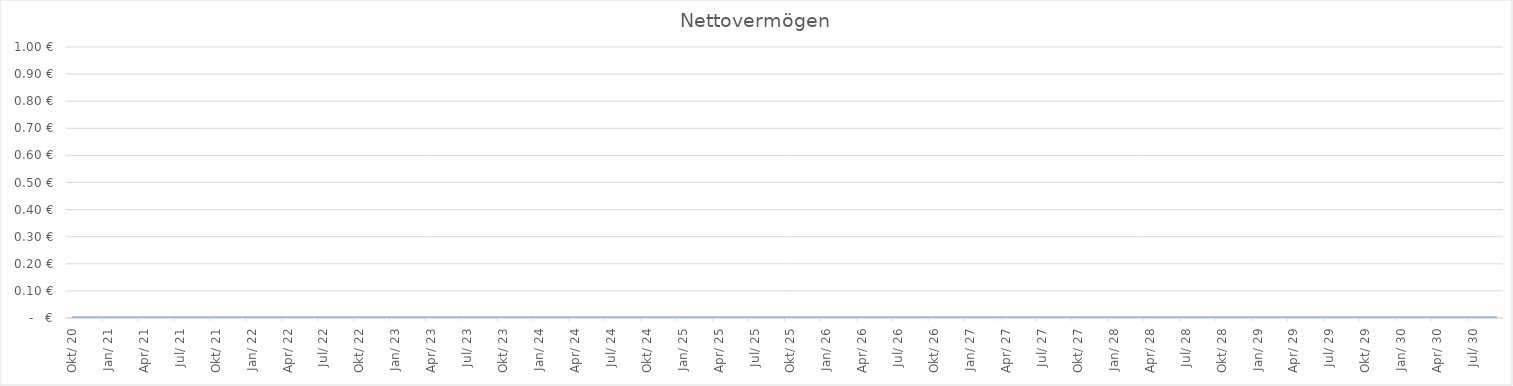
| Category | Nettovermögen |
|---|---|
| 2020-10-01 | 0 |
| 2020-11-01 | 0 |
| 2020-12-01 | 0 |
| 2021-01-01 | 0 |
| 2021-02-01 | 0 |
| 2021-03-01 | 0 |
| 2021-04-01 | 0 |
| 2021-05-01 | 0 |
| 2021-06-01 | 0 |
| 2021-07-01 | 0 |
| 2021-08-01 | 0 |
| 2021-09-01 | 0 |
| 2021-10-01 | 0 |
| 2021-11-01 | 0 |
| 2021-12-01 | 0 |
| 2022-01-01 | 0 |
| 2022-02-01 | 0 |
| 2022-03-01 | 0 |
| 2022-04-01 | 0 |
| 2022-05-01 | 0 |
| 2022-06-01 | 0 |
| 2022-07-01 | 0 |
| 2022-08-01 | 0 |
| 2022-09-01 | 0 |
| 2022-10-01 | 0 |
| 2022-11-01 | 0 |
| 2022-12-01 | 0 |
| 2023-01-01 | 0 |
| 2023-02-01 | 0 |
| 2023-03-01 | 0 |
| 2023-04-01 | 0 |
| 2023-05-01 | 0 |
| 2023-06-01 | 0 |
| 2023-07-01 | 0 |
| 2023-08-01 | 0 |
| 2023-09-01 | 0 |
| 2023-10-01 | 0 |
| 2023-11-01 | 0 |
| 2023-12-01 | 0 |
| 2024-01-01 | 0 |
| 2024-02-01 | 0 |
| 2024-03-01 | 0 |
| 2024-04-01 | 0 |
| 2024-05-01 | 0 |
| 2024-06-01 | 0 |
| 2024-07-01 | 0 |
| 2024-08-01 | 0 |
| 2024-09-01 | 0 |
| 2024-10-01 | 0 |
| 2024-11-01 | 0 |
| 2024-12-01 | 0 |
| 2025-01-01 | 0 |
| 2025-02-01 | 0 |
| 2025-03-01 | 0 |
| 2025-04-01 | 0 |
| 2025-05-01 | 0 |
| 2025-06-01 | 0 |
| 2025-07-01 | 0 |
| 2025-08-01 | 0 |
| 2025-09-01 | 0 |
| 2025-10-01 | 0 |
| 2025-11-01 | 0 |
| 2025-12-01 | 0 |
| 2026-01-01 | 0 |
| 2026-02-01 | 0 |
| 2026-03-01 | 0 |
| 2026-04-01 | 0 |
| 2026-05-01 | 0 |
| 2026-06-01 | 0 |
| 2026-07-01 | 0 |
| 2026-08-01 | 0 |
| 2026-09-01 | 0 |
| 2026-10-01 | 0 |
| 2026-11-01 | 0 |
| 2026-12-01 | 0 |
| 2027-01-01 | 0 |
| 2027-02-01 | 0 |
| 2027-03-01 | 0 |
| 2027-04-01 | 0 |
| 2027-05-01 | 0 |
| 2027-06-01 | 0 |
| 2027-07-01 | 0 |
| 2027-08-01 | 0 |
| 2027-09-01 | 0 |
| 2027-10-01 | 0 |
| 2027-11-01 | 0 |
| 2027-12-01 | 0 |
| 2028-01-01 | 0 |
| 2028-02-01 | 0 |
| 2028-03-01 | 0 |
| 2028-04-01 | 0 |
| 2028-05-01 | 0 |
| 2028-06-01 | 0 |
| 2028-07-01 | 0 |
| 2028-08-01 | 0 |
| 2028-09-01 | 0 |
| 2028-10-01 | 0 |
| 2028-11-01 | 0 |
| 2028-12-01 | 0 |
| 2029-01-01 | 0 |
| 2029-02-01 | 0 |
| 2029-03-01 | 0 |
| 2029-04-01 | 0 |
| 2029-05-01 | 0 |
| 2029-06-01 | 0 |
| 2029-07-01 | 0 |
| 2029-08-01 | 0 |
| 2029-09-01 | 0 |
| 2029-10-01 | 0 |
| 2029-11-01 | 0 |
| 2029-12-01 | 0 |
| 2030-01-01 | 0 |
| 2030-02-01 | 0 |
| 2030-03-01 | 0 |
| 2030-04-01 | 0 |
| 2030-05-01 | 0 |
| 2030-06-01 | 0 |
| 2030-07-01 | 0 |
| 2030-08-01 | 0 |
| 2030-09-01 | 0 |